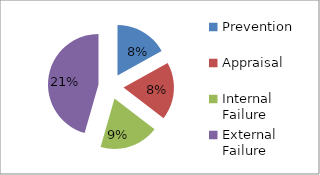
| Category | Series 0 | Series 1 | Series 2 |
|---|---|---|---|
| Prevention | 0.078 | 1280000 | 560000 |
| Appraisal | 0.085 | 1400000 | 800000 |
| Internal Failure | 0.087 | 1440000 | 1020000 |
| External Failure | 0.209 | 3448000 | 2336000 |